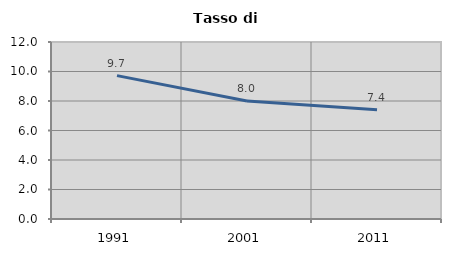
| Category | Tasso di disoccupazione   |
|---|---|
| 1991.0 | 9.722 |
| 2001.0 | 8 |
| 2011.0 | 7.407 |